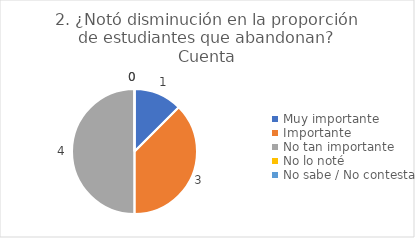
| Category | 2. ¿Notó disminución en la proporción de estudiantes que abandonan? |
|---|---|
| Muy importante  | 0.125 |
| Importante  | 0.375 |
| No tan importante  | 0.5 |
| No lo noté  | 0 |
| No sabe / No contesta | 0 |